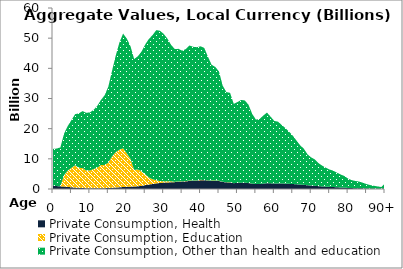
| Category | Private Consumption, Health | Private Consumption, Education | Private Consumption, Other than health and education |
|---|---|---|---|
| 0 | 1081.54 | 0 | 12214.436 |
|  | 973.074 | 0 | 12427.089 |
| 2 | 881.851 | 0 | 12910.15 |
| 3 | 798.485 | 3797.943 | 13785.288 |
| 4 | 695.042 | 5440.388 | 14741.848 |
| 5 | 579.413 | 6433.891 | 15829.973 |
| 6 | 468.019 | 7419.674 | 16928.62 |
| 7 | 397.341 | 6622.048 | 18049.566 |
| 8 | 329.412 | 6651.009 | 18843.446 |
| 9 | 258.759 | 5863.513 | 19155.423 |
| 10 | 205.676 | 5927.532 | 19236.496 |
| 11 | 217.842 | 6399.01 | 19628.695 |
| 12 | 233.572 | 6798.197 | 20532.711 |
| 13 | 248.326 | 7737.878 | 21542.22 |
| 14 | 273.559 | 7665.86 | 23126.315 |
| 15 | 328.799 | 8390.764 | 25233.164 |
| 16 | 399.27 | 10424.633 | 28337.041 |
| 17 | 477.838 | 11746.535 | 31965.612 |
| 18 | 567.482 | 12443.342 | 35525.492 |
| 19 | 650.473 | 12858.275 | 38018.82 |
| 20 | 726.971 | 11118.52 | 38023.712 |
| 21 | 772.051 | 9226.227 | 37359.144 |
| 22 | 819.924 | 5533.28 | 36736.477 |
| 23 | 901.277 | 5568.218 | 37526.809 |
| 24 | 1039.327 | 4828.261 | 39700.476 |
| 25 | 1279.17 | 3615.315 | 43008.141 |
| 26 | 1475.454 | 2329.439 | 45947.834 |
| 27 | 1654.101 | 1584.789 | 47782.006 |
| 28 | 1858.203 | 1059.073 | 49747.581 |
| 29 | 1988.824 | 636.574 | 49831.628 |
| 30 | 2117.481 | 476.107 | 48833.414 |
| 31 | 2165.49 | 381.904 | 47324.807 |
| 32 | 2221.843 | 340.711 | 45235.146 |
| 33 | 2278.588 | 134.411 | 43992.897 |
| 34 | 2391.73 | 106.047 | 43962.451 |
| 35 | 2468.256 | 130.555 | 43267.458 |
| 36 | 2540.027 | 77.816 | 43769.851 |
| 37 | 2664.186 | 162.852 | 44738.873 |
| 38 | 2726.039 | 60.817 | 44349.359 |
| 39 | 2767.741 | 65.111 | 44178.593 |
| 40 | 2878.387 | 184.035 | 44248.737 |
| 41 | 2899.865 | 60.444 | 43822.29 |
| 42 | 2808.577 | 53.3 | 41012.395 |
| 43 | 2675.132 | 133.434 | 38371.694 |
| 44 | 2697.152 | 130.85 | 37635.334 |
| 45 | 2645.455 | 119.655 | 36187.792 |
| 46 | 2341.979 | 68.434 | 31855.675 |
| 47 | 2198.932 | 31.866 | 29886.902 |
| 48 | 2168.757 | 108.583 | 29613.727 |
| 49 | 1930.994 | 0 | 26270.057 |
| 50 | 1998.808 | 16.657 | 26796.288 |
| 51 | 2049.723 | 55.92 | 27411.26 |
| 52 | 2053.689 | 40.414 | 27259.467 |
| 53 | 1961.893 | 4.463 | 25966.378 |
| 54 | 1749.608 | 25.043 | 23120.171 |
| 55 | 1655.017 | 12.581 | 21352.247 |
| 56 | 1680.492 | 12.99 | 21496.442 |
| 57 | 1787.318 | 0 | 22564.356 |
| 58 | 1912.754 | 0 | 23423.402 |
| 59 | 1874.863 | 4.883 | 22083.312 |
| 60 | 1810.237 | 0 | 20743.294 |
| 61 | 1843.381 | 16.228 | 20455.051 |
| 62 | 1796.719 | 10.845 | 19415.384 |
| 63 | 1772.192 | 0 | 18440.768 |
| 64 | 1708.704 | 0 | 17290.772 |
| 65 | 1655.157 | 0 | 16036.894 |
| 66 | 1542.035 | 0 | 14513.152 |
| 67 | 1461.536 | 0 | 13032.356 |
| 68 | 1390.969 | 0 | 11961.457 |
| 69 | 1226.021 | 0 | 10263.521 |
| 70 | 1130.962 | 0 | 9336.167 |
| 71 | 1060.999 | 0 | 8730.619 |
| 72 | 928.601 | 0 | 7629.631 |
| 73 | 843.884 | 0 | 6881.065 |
| 74 | 764.083 | 4.212 | 6266.765 |
| 75 | 700.683 | 0 | 5737.566 |
| 76 | 652.222 | 0 | 5407.158 |
| 77 | 572.4 | 4.639 | 4819.043 |
| 78 | 494.701 | 0 | 4304.018 |
| 79 | 438.998 | 0 | 3855.762 |
| 80 | 348.491 | 0 | 3086.796 |
| 81 | 296.861 | 0 | 2625.141 |
| 82 | 270.618 | 0 | 2390.228 |
| 83 | 251.096 | 0 | 2208.757 |
| 84 | 212.037 | 0 | 1857.601 |
| 85 | 167.593 | 0 | 1462.893 |
| 86 | 134.213 | 0 | 1165.121 |
| 87 | 110.168 | 0 | 950.695 |
| 88 | 89.053 | 0 | 762.814 |
| 89 | 69.966 | 0 | 594.71 |
| 90+ | 199.567 | 0 | 1682.812 |